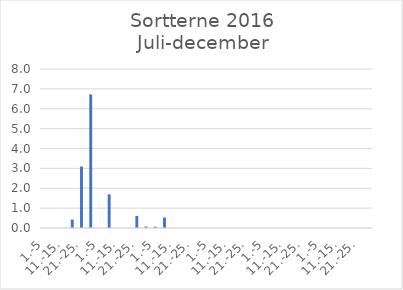
| Category | Series 0 |
|---|---|
| 1.-5 | 0 |
| 6.-10. | 0 |
| 11.-15. | 0 |
| 16.-20. | 0.426 |
| 21.-25. | 3.094 |
| 26.-31. | 6.722 |
| 1.-5 | 0 |
| 6.-10. | 1.691 |
| 11.-15. | 0 |
| 16.-20. | 0 |
| 21.-25. | 0.607 |
| 26.-31. | 0.074 |
| 1.-5 | 0.064 |
| 6.-10. | 0.523 |
| 11.-15. | 0 |
| 16.-20. | 0 |
| 21.-25. | 0 |
| 26.-30. | 0 |
| 1.-5 | 0 |
| 6.-10. | 0 |
| 11.-15. | 0 |
| 16.-20. | 0 |
| 21.-25. | 0 |
| 26.-31. | 0 |
| 1.-5 | 0 |
| 6.-10. | 0 |
| 11.-15. | 0 |
| 16.-20. | 0 |
| 21.-25. | 0 |
| 26.-30. | 0 |
| 1.-5 | 0 |
| 6.-10. | 0 |
| 11.-15. | 0 |
| 16.-20. | 0 |
| 21.-25. | 0 |
| 26.-31. | 0 |